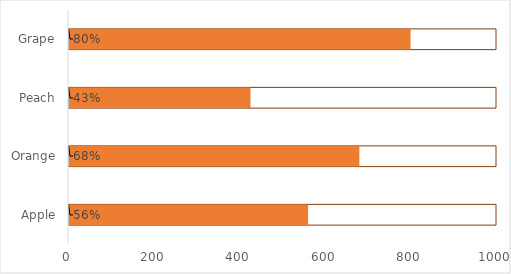
| Category | Target | Actual | Percentage |
|---|---|---|---|
| Apple | 1000 | 560 | 0.56 |
| Orange | 1000 | 680 | 0.68 |
| Peach | 1000 | 425 | 0.425 |
| Grape | 1000 | 800 | 0.8 |